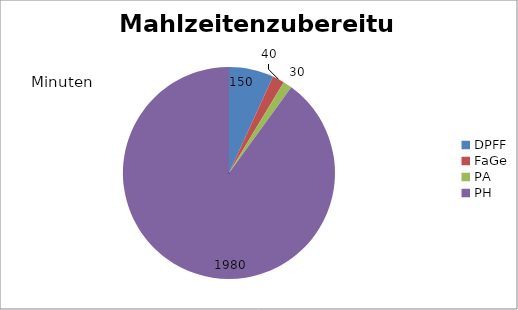
| Category | Mahlzeitenzubereitung |
|---|---|
| DPFF | 150 |
| FaGe | 40 |
| PA | 30 |
| PH | 1980 |